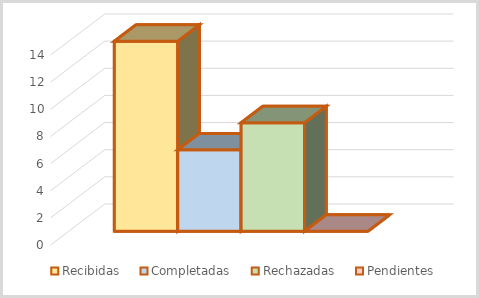
| Category | Recibidas | Completadas | Rechazadas | Pendientes |
|---|---|---|---|---|
| 0 | 14 | 6 | 8 | 0 |